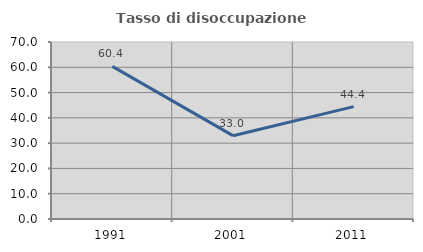
| Category | Tasso di disoccupazione giovanile  |
|---|---|
| 1991.0 | 60.36 |
| 2001.0 | 32.955 |
| 2011.0 | 44.444 |